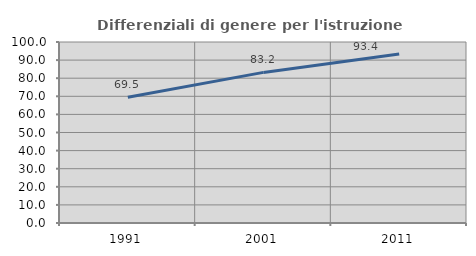
| Category | Differenziali di genere per l'istruzione superiore |
|---|---|
| 1991.0 | 69.514 |
| 2001.0 | 83.205 |
| 2011.0 | 93.387 |